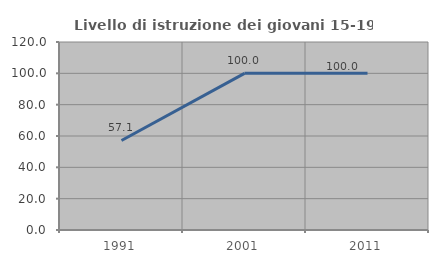
| Category | Livello di istruzione dei giovani 15-19 anni |
|---|---|
| 1991.0 | 57.143 |
| 2001.0 | 100 |
| 2011.0 | 100 |